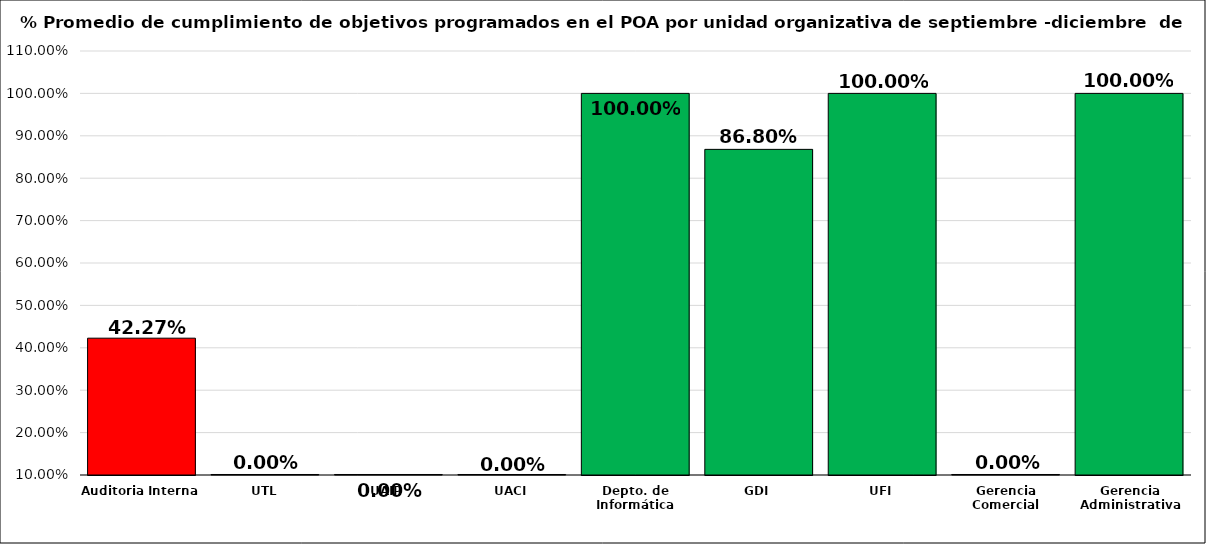
| Category | Series 0 |
|---|---|
| Auditoria Interna | 0.423 |
| UTL | 0 |
| UAIP | 0 |
| UACI | 0 |
| Depto. de Informática | 1 |
| GDI | 0.868 |
| UFI | 1 |
| Gerencia Comercial | 0 |
| Gerencia Administrativa | 1 |